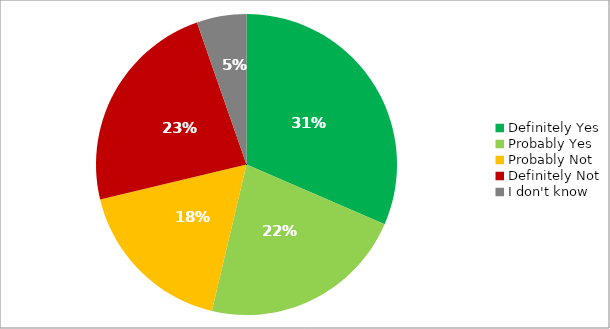
| Category | Responses |
|---|---|
| Definitely Yes | 0.315 |
| Probably Yes | 0.222 |
| Probably Not | 0.176 |
| Definitely Not | 0.234 |
| I don't know | 0.053 |